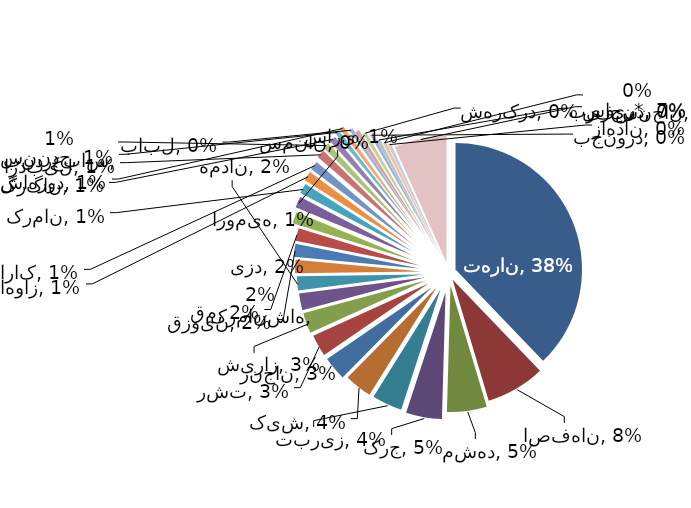
| Category | Series 0 |
|---|---|
| تهران | 462 |
| اصفهان | 92 |
| مشهد | 62 |
| کرج | 56 |
| تبریز | 47 |
| کیش | 43 |
| زنجان | 37 |
| رشت | 34 |
| شیراز | 32 |
| کرمانشاه | 26 |
| همدان | 22 |
| یزد | 21 |
| قزوین | 20 |
| قم | 20 |
| ارومیه | 18 |
| ساری | 17 |
| کرمان | 16 |
| اهواز | 15 |
| اراک | 14 |
| اردبیل | 13 |
| بندرعباس | 10 |
| گرگان | 10 |
| سنندج | 7 |
| شاهرود | 7 |
| بابل | 6 |
| سمنان | 6 |
| شهرکرد | 6 |
| بجنورد | 5 |
| بیرجند | 5 |
| رفسنجان | 5 |
| زاهدان | 5 |
| سایر* | 82 |